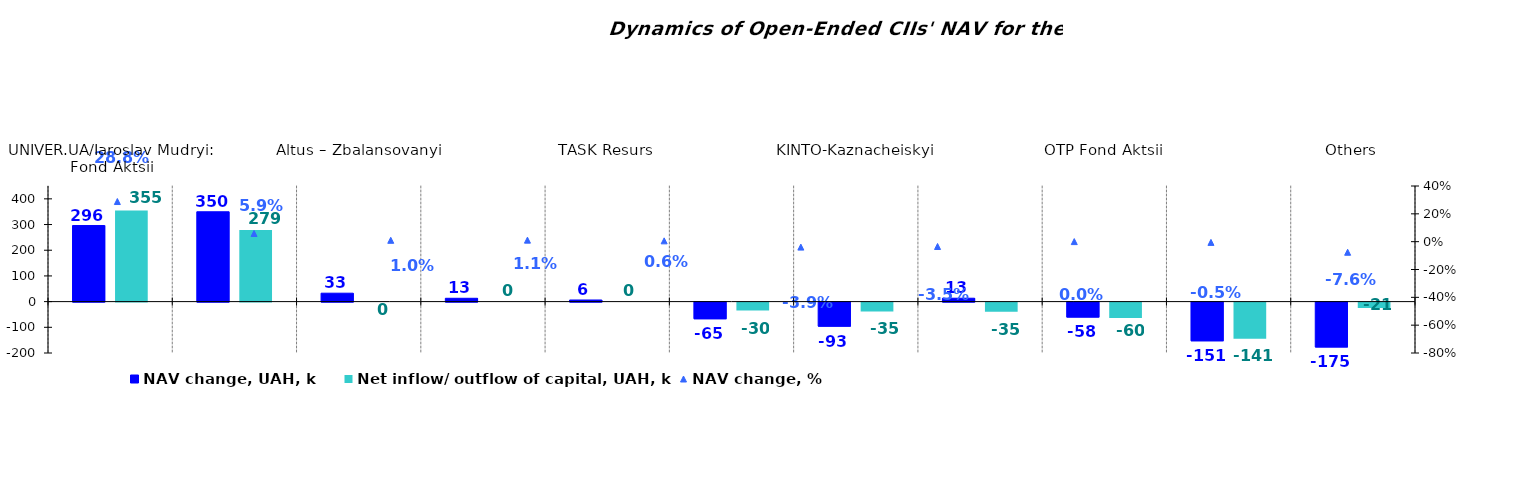
| Category | NAV change, UAH, k | Net inflow/ outflow of capital, UAH, k |
|---|---|---|
| UNIVER.UA/Iaroslav Mudryi: Fond Aktsii | 296.132 | 354.946 |
| OTP Klasychnyi' | 349.7 | 278.772 |
| Altus – Zbalansovanyi | 32.753 | 0 |
| UNIVER.UA/Taras Shevchenko: Fond Zaoshchadzhen | 12.97 | 0 |
| ТАSK Resurs | 6.298 | 0 |
| VSI | -64.736 | -30.345 |
| KINTO-Kaznacheiskyi | -93.458 | -34.596 |
| КІNТО-Klasychnyi | 13.211 | -35.211 |
| OTP Fond Aktsii | -58.405 | -60.299 |
| Argentum | -150.564 | -140.65 |
| Others | -174.64 | -21.361 |